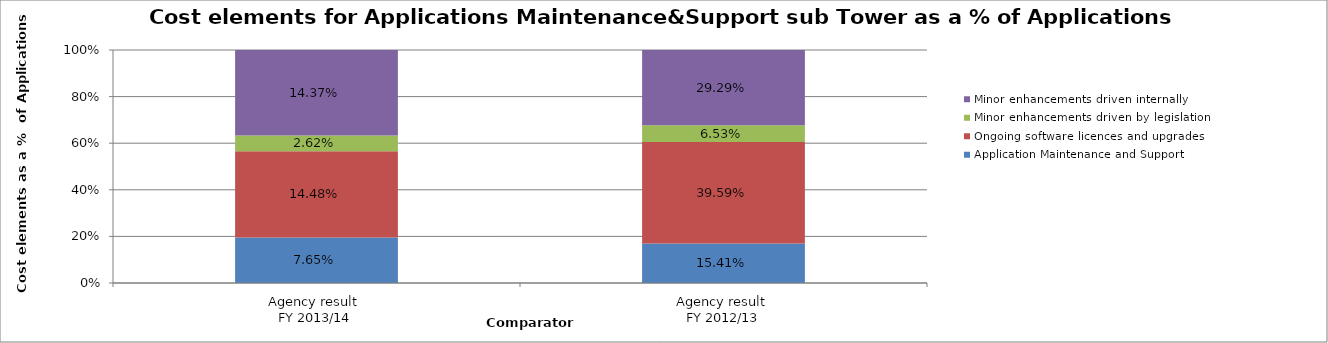
| Category | Application Maintenance and Support | Ongoing software licences and upgrades | Minor enhancements driven by legislation | Minor enhancements driven internally |
|---|---|---|---|---|
| Agency result 
FY 2013/14 | 0.076 | 0.145 | 0.026 | 0.144 |
| Agency result 
FY 2012/13 | 0.154 | 0.396 | 0.065 | 0.293 |